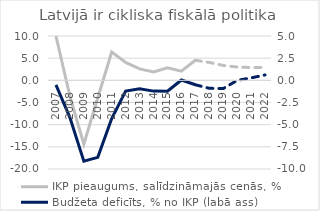
| Category | IKP pieaugums, salīdzināmajās cenās, %  |
|---|---|
| 2007 | 9.979 |
| 2008 | -3.548 |
| 2009 | -14.402 |
| 2010 | -3.941 |
| 2011 | 6.381 |
| 2012 | 4.035 |
| 2013 | 2.58 |
| 2014 | 1.913 |
| 2015 | 2.837 |
| 2016 | 2.076 |
| 2017 | 4.521 |
| 2018 | 4.033 |
| 2019 | 3.367 |
| 2020 | 2.995 |
| 2021 | 2.892 |
| 2022 | 2.9 |